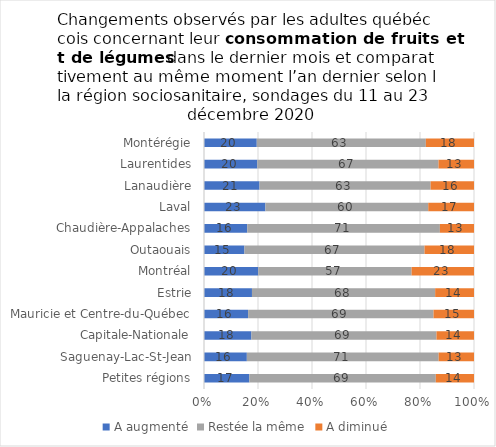
| Category | A augmenté | Restée la même | A diminué |
|---|---|---|---|
| Petites régions | 16.785 | 69.065 | 14.15 |
| Saguenay-Lac-St-Jean | 15.87 | 71.038 | 13.092 |
| Capitale-Nationale | 17.565 | 68.544 | 13.892 |
| Mauricie et Centre-du-Québec | 16.339 | 68.67 | 14.992 |
| Estrie | 17.765 | 67.848 | 14.387 |
| Montréal | 20.084 | 56.807 | 23.109 |
| Outaouais | 14.973 | 66.7 | 18.326 |
| Chaudière-Appalaches | 16.013 | 71.358 | 12.629 |
| Laval | 22.749 | 60.303 | 16.947 |
| Lanaudière | 20.562 | 63.381 | 16.057 |
| Laurentides | 19.744 | 67.109 | 13.147 |
| Montérégie | 19.543 | 62.624 | 17.833 |